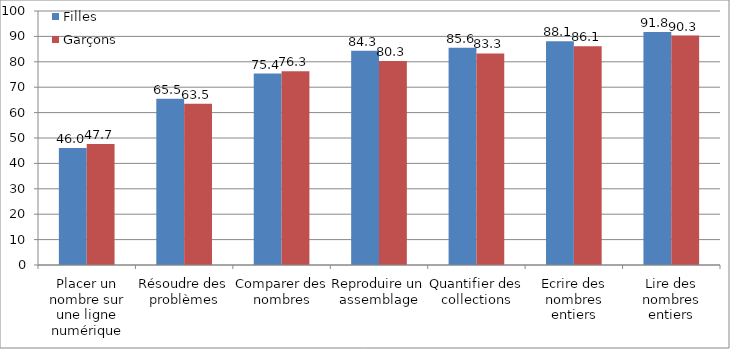
| Category | Filles  | Garçons |
|---|---|---|
| Placer un nombre sur une ligne numérique | 46.03 | 47.67 |
| Résoudre des problèmes | 65.47 | 63.45 |
| Comparer des nombres | 75.38 | 76.25 |
| Reproduire un assemblage | 84.31 | 80.3 |
| Quantifier des collections | 85.58 | 83.28 |
| Ecrire des nombres entiers | 88.07 | 86.08 |
| Lire des nombres entiers | 91.78 | 90.33 |